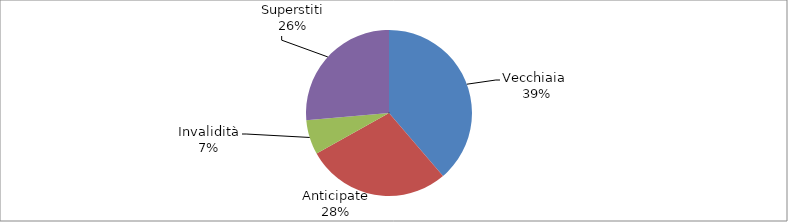
| Category | Series 0 |
|---|---|
| Vecchiaia  | 28462 |
| Anticipate | 20689 |
| Invalidità | 4954 |
| Superstiti | 19398 |